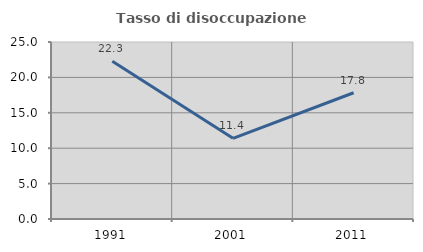
| Category | Tasso di disoccupazione giovanile  |
|---|---|
| 1991.0 | 22.269 |
| 2001.0 | 11.392 |
| 2011.0 | 17.829 |